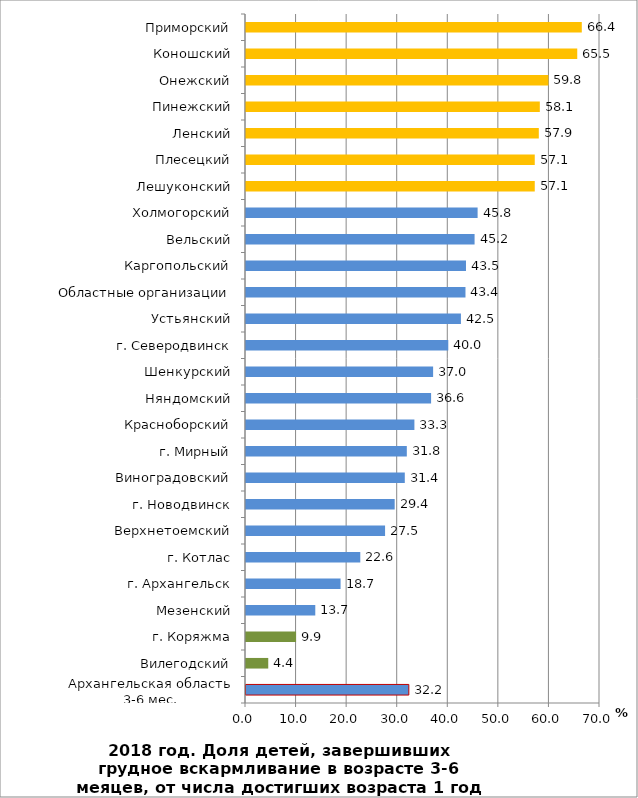
| Category | Series 0 |
|---|---|
| Архангельская область 3-6 мес. | 32.2 |
| Вилегодский | 4.4 |
| г. Коряжма | 9.9 |
| Мезенский | 13.7 |
| г. Архангельск | 18.7 |
| г. Котлас | 22.6 |
| Верхнетоемский | 27.5 |
| г. Новодвинск | 29.4 |
| Виноградовский | 31.4 |
| г. Мирный | 31.8 |
| Красноборский | 33.3 |
| Няндомский | 36.6 |
| Шенкурский | 37 |
| г. Северодвинск | 40 |
| Устьянский | 42.5 |
| Областные организации | 43.4 |
| Каргопольский | 43.5 |
| Вельский | 45.2 |
| Холмогорский | 45.8 |
| Лешуконский | 57.1 |
| Плесецкий | 57.1 |
| Ленский | 57.9 |
| Пинежский | 58.1 |
| Онежский | 59.8 |
| Коношский | 65.5 |
| Приморский | 66.4 |